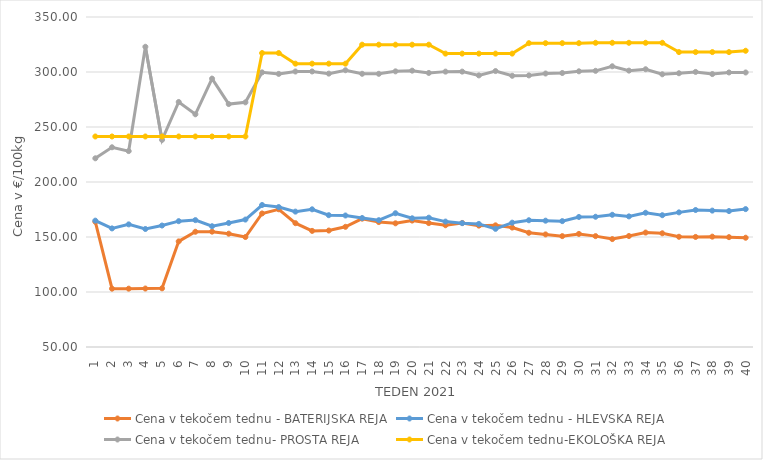
| Category | Cena v tekočem tednu - BATERIJSKA REJA | Cena v tekočem tednu - HLEVSKA REJA | Cena v tekočem tednu- PROSTA REJA | Cena v tekočem tednu-EKOLOŠKA REJA |
|---|---|---|---|---|
| 1.0 | 163.81 | 164.86 | 221.55 | 241.38 |
| 2.0 | 103.02 | 157.81 | 231.55 | 241.38 |
| 3.0 | 103.03 | 161.48 | 228.1 | 241.38 |
| 4.0 | 103.15 | 157.29 | 322.93 | 241.38 |
| 5.0 | 103.34 | 160.43 | 238.28 | 241.38 |
| 6.0 | 146.03 | 164.39 | 272.76 | 241.38 |
| 7.0 | 154.77 | 165.34 | 261.55 | 241.38 |
| 8.0 | 154.86 | 159.79 | 293.97 | 241.38 |
| 9.0 | 153 | 162.73 | 270.86 | 241.38 |
| 10.0 | 149.98 | 165.85 | 272.41 | 241.38 |
| 11.0 | 171.4 | 179.09 | 299.66 | 317.24 |
| 12.0 | 175.2 | 177.21 | 298.27 | 317.24 |
| 13.0 | 162.57 | 173.07 | 300.45 | 307.59 |
| 14.0 | 155.55 | 175.17 | 300.49 | 307.59 |
| 15.0 | 155.88 | 169.83 | 298.52 | 307.59 |
| 16.0 | 159.26 | 169.55 | 301.6 | 307.59 |
| 17.0 | 166.66 | 167.25 | 298.38 | 324.83 |
| 18.0 | 163.58 | 165.28 | 298.35 | 324.83 |
| 19.0 | 162.44 | 171.6 | 300.59 | 324.83 |
| 20.0 | 164.94 | 167.01 | 301.21 | 324.83 |
| 21.0 | 162.64 | 167.56 | 299.14 | 324.83 |
| 22.0 | 160.68 | 164.01 | 300.34 | 316.72 |
| 23.0 | 162.75 | 162.58 | 300.35 | 316.72 |
| 24.0 | 160.34 | 161.89 | 296.9 | 316.72 |
| 25.0 | 160.61 | 157.42 | 300.86 | 316.72 |
| 26.0 | 158.57 | 163.03 | 296.55 | 316.72 |
| 27.0 | 153.83 | 165.23 | 296.9 | 326.21 |
| 28.0 | 152.35 | 164.83 | 298.63 | 326.21 |
| 29.0 | 150.79 | 164.42 | 299.08 | 326.21 |
| 30.0 | 152.82 | 168.2 | 300.63 | 326.21 |
| 31.0 | 150.8 | 168.4 | 301.07 | 326.55 |
| 32.0 | 148.1 | 170.19 | 305.2 | 326.55 |
| 33.0 | 150.88 | 168.74 | 301.25 | 326.55 |
| 34.0 | 154.04 | 172.03 | 302.51 | 326.55 |
| 35.0 | 153.37 | 169.81 | 297.92 | 326.55 |
| 36.0 | 150.21 | 172.4 | 298.86 | 318.1 |
| 37.0 | 150.06 | 174.54 | 300.07 | 318.1 |
| 38.0 | 150.32 | 173.99 | 298.12 | 318.1 |
| 39.0 | 149.86 | 173.58 | 299.58 | 318.1 |
| 40.0 | 149.34 | 175.36 | 299.56 | 319.31 |